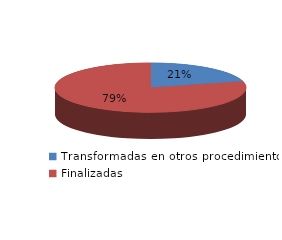
| Category | Series 0 |
|---|---|
| Transformadas en otros procedimientos | 11152 |
| Finalizadas | 42206 |